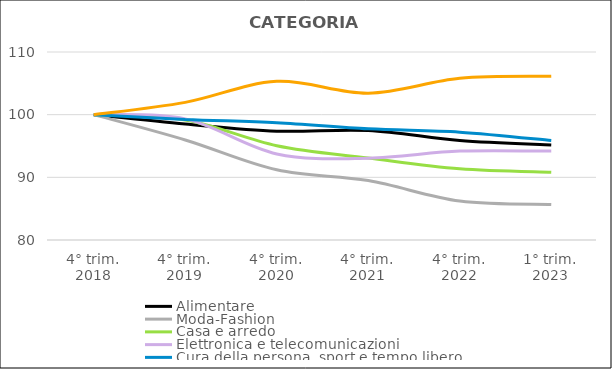
| Category | Alimentare | Moda-Fashion | Casa e arredo | Elettronica e telecomunicazioni | Cura della persona, sport e tempo libero | Autoveicoli e motocicli |
|---|---|---|---|---|---|---|
| 4° trim.
2018 | 100 | 100 | 100 | 100 | 100 | 100 |
| 4° trim.
2019 | 98.507 | 95.958 | 99.159 | 99.329 | 99.245 | 101.962 |
| 4° trim.
2020 | 97.369 | 91.198 | 95.049 | 93.736 | 98.722 | 105.315 |
| 4° trim.
2021 | 97.47 | 89.478 | 93.087 | 93.065 | 97.734 | 103.434 |
| 4° trim.
2022 | 95.877 | 86.21 | 91.359 | 94.183 | 97.211 | 105.805 |
| 1° trim.
2023 | 95.143 | 85.665 | 90.799 | 94.183 | 95.874 | 106.132 |